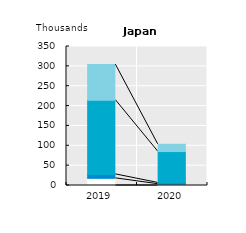
| Category | International seasonal workers | Working holidaymakers | Intra-company transferees | International trainees | Other temporary migrant workers |
|---|---|---|---|---|---|
| 2019.0 |  | 18.022 | 9.964 | 186.881 | 89.495 |
| 2020.0 |  | 3.329 | 3.188 | 78.966 | 18.316 |